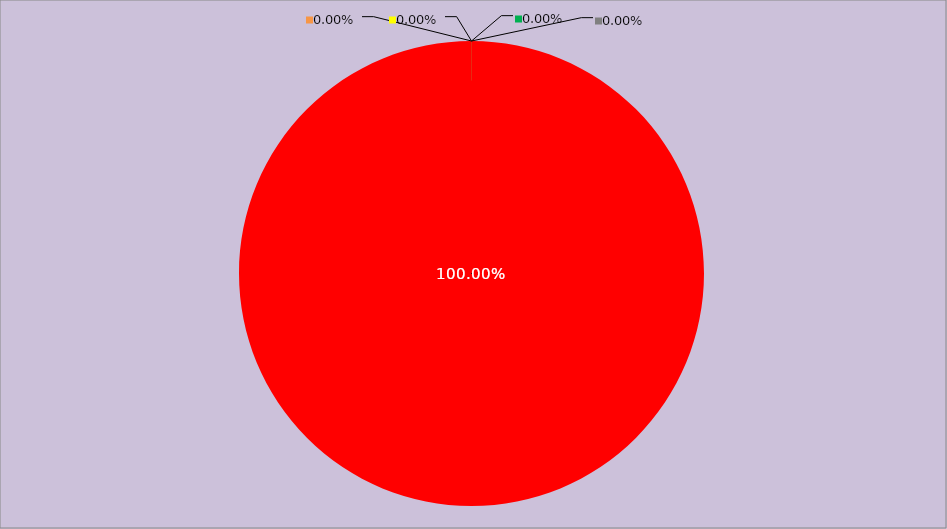
| Category | Année 2021 |
|---|---|
| Mesures non appliquées | 168 |
| Mesures appliquées mais peu ou pas documentées | 0 |
| Mesures appliquées et documentées | 0 |
| Mesures appliquées, documentées et contrôlées | 0 |
| Mesures non applicables | 0 |